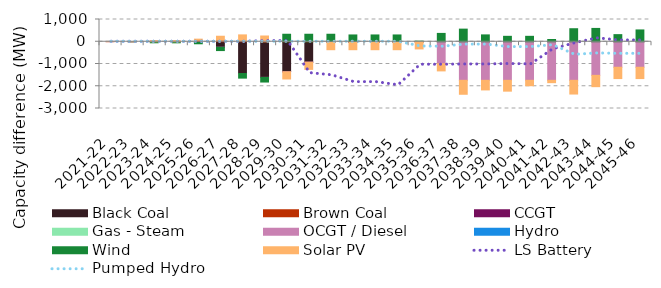
| Category | Black Coal | Brown Coal | CCGT | Gas - Steam | OCGT / Diesel | Hydro | Wind | Solar PV |
|---|---|---|---|---|---|---|---|---|
| 2021-22 | 0 | 0 | 0 | 0 | -0.001 | 0 | 0 | -0.004 |
| 2022-23 | 0 | 0 | -0.001 | 0 | -0.001 | 0 | -0.019 | 0.005 |
| 2023-24 | 0 | 0 | -0.001 | 0 | -0.002 | 0 | -46.229 | 52.183 |
| 2024-25 | 0.003 | -1.572 | -0.001 | 0 | -0.002 | 0 | -46.23 | 52.183 |
| 2025-26 | -34.49 | 64.522 | -0.001 | 0 | -0.003 | 0 | -56.568 | 52.135 |
| 2026-27 | -247.715 | 64.523 | -0.001 | 0 | -0.003 | 0 | -148.944 | 183.246 |
| 2027-28 | -1427.258 | 50.172 | -0.001 | 0 | -0.003 | 0 | -207.791 | 258.357 |
| 2028-29 | -1602.83 | 0 | -0.001 | 0 | -0.003 | 0 | -207.792 | 258.356 |
| 2029-30 | -1350.637 | 0 | -0.001 | 0 | -0.003 | 0 | 337.237 | -322.991 |
| 2030-31 | -918.835 | 0 | -0.001 | 0 | -0.003 | 0 | 337.237 | -322.991 |
| 2031-32 | -34.495 | 0 | -0.001 | 0 | -0.003 | 0 | 337.237 | -322.992 |
| 2032-33 | -34.49 | 0 | -0.001 | 0 | -0.003 | 0 | 305.684 | -322.995 |
| 2033-34 | -34.49 | 0 | -0.001 | 0 | -0.003 | 0 | 305.682 | -322.996 |
| 2034-35 | -34.49 | 0 | -0.002 | 0 | -0.003 | 0 | 305.677 | -322.997 |
| 2035-36 | 0 | 0 | -0.002 | 0 | -0.008 | 0 | 26.453 | -323.009 |
| 2036-37 | 0 | 0 | -0.002 | 0 | -987.039 | 0 | 374.944 | -323.009 |
| 2037-38 | 0 | 0 | -0.004 | 0 | -1733.289 | 0 | 567.348 | -627.267 |
| 2038-39 | 0 | 0 | -0.004 | 0 | -1733.289 | 0 | 308.145 | -431.841 |
| 2039-40 | 0 | 0 | -0.004 | 0 | -1733.289 | 0 | 243.991 | -487.093 |
| 2040-41 | 0 | 0 | -0.004 | 0 | -1733.29 | 0 | 243.991 | -243.413 |
| 2041-42 | 0 | 0 | -0.005 | 0 | -1733.29 | 0 | 100.717 | -105.819 |
| 2042-43 | 0 | 0 | -0.005 | 0 | -1733.29 | 0 | 585.395 | -616.824 |
| 2043-44 | 0 | 0 | -0.006 | 0 | -1510.087 | 0 | 598.946 | -508.602 |
| 2044-45 | 0 | 0 | -0.006 | 0 | -1146.642 | 0 | 319.825 | -508.602 |
| 2045-46 | 0 | 0 | -0.006 | 0 | -1146.642 | 0 | 531.151 | -508.604 |